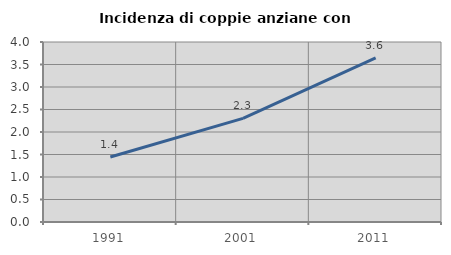
| Category | Incidenza di coppie anziane con figli |
|---|---|
| 1991.0 | 1.444 |
| 2001.0 | 2.303 |
| 2011.0 | 3.645 |